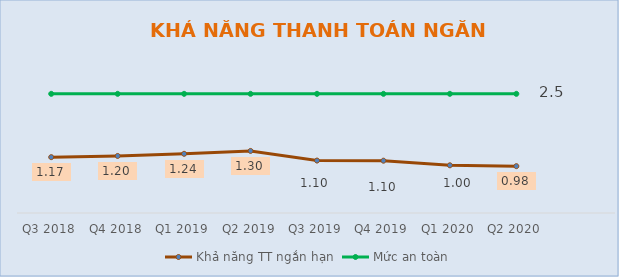
| Category | Khả năng TT ngắn hạn | Mức an toàn |
|---|---|---|
| Q3 2018 | 1.172 | 2.5 |
| Q4 2018 | 1.197 | 2.5 |
| Q1 2019 | 1.242 | 2.5 |
| Q2 2019 | 1.302 | 2.5 |
| Q3 2019 | 1.1 | 2.5 |
| Q4 2019 | 1.097 | 2.5 |
| Q1 2020 | 1.001 | 2.5 |
| Q2 2020 | 0.983 | 2.5 |